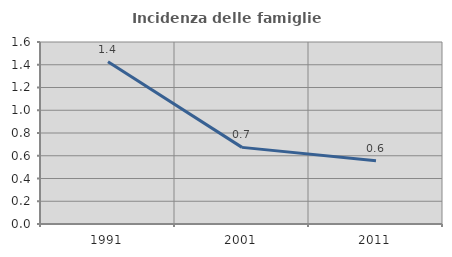
| Category | Incidenza delle famiglie numerose |
|---|---|
| 1991.0 | 1.427 |
| 2001.0 | 0.674 |
| 2011.0 | 0.556 |